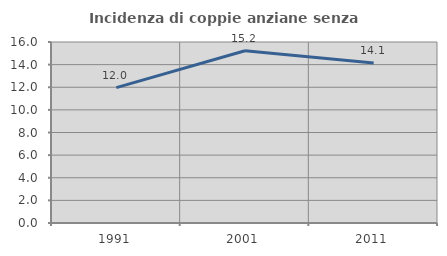
| Category | Incidenza di coppie anziane senza figli  |
|---|---|
| 1991.0 | 11.966 |
| 2001.0 | 15.223 |
| 2011.0 | 14.133 |